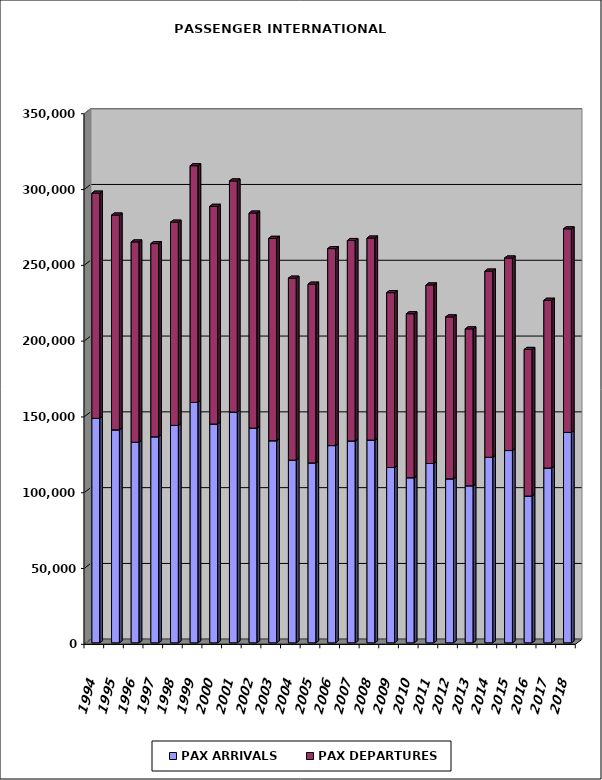
| Category | PAX ARRIVALS | PAX DEPARTURES |
|---|---|---|
| 1994.0 | 148086 | 148554 |
| 1995.0 | 140472 | 141720 |
| 1996.0 | 132294 | 132136 |
| 1997.0 | 135911 | 127423 |
| 1998.0 | 143404 | 134094 |
| 1999.0 | 158602 | 156102 |
| 2000.0 | 144322 | 143626 |
| 2001.0 | 152173 | 152513 |
| 2002.0 | 141649 | 141839 |
| 2003.0 | 133290 | 133545 |
| 2004.0 | 120502 | 120060 |
| 2005.0 | 118654 | 117939 |
| 2006.0 | 130101 | 129938 |
| 2007.0 | 133154 | 132228 |
| 2008.0 | 133718 | 133275 |
| 2009.0 | 115639 | 115329 |
| 2010.0 | 108882 | 108153 |
| 2011.0 | 118274 | 117774 |
| 2012.0 | 108151 | 106833 |
| 2013.0 | 103563 | 103513 |
| 2014.0 | 122392 | 122809 |
| 2015.0 | 126830 | 127018 |
| 2016.0 | 96830 | 96710 |
| 2017.0 | 115293 | 110669 |
| 2018.0 | 138800 | 134297 |